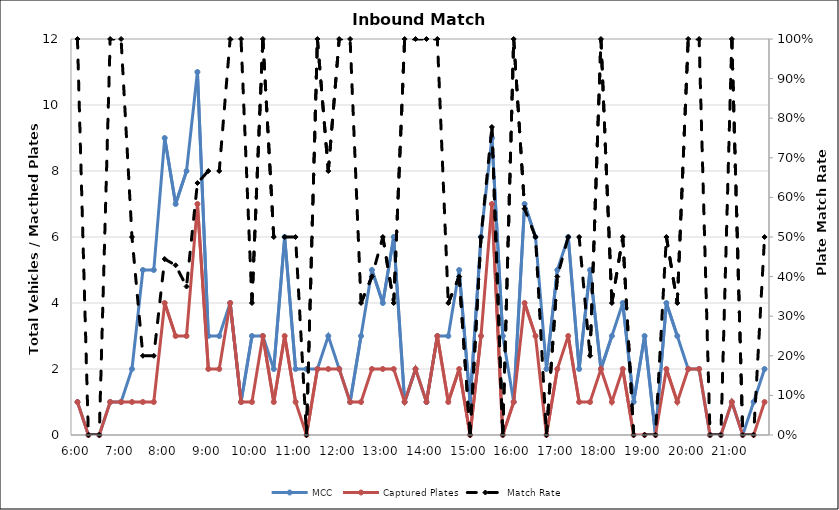
| Category | MCC | Captured Plates |
|---|---|---|
| 0.25 | 1 | 1 |
| 0.260416666666667 | 0 | 0 |
| 0.270833333333333 | 0 | 0 |
| 0.28125 | 1 | 1 |
| 0.291666666666667 | 1 | 1 |
| 0.302083333333333 | 2 | 1 |
| 0.3125 | 5 | 1 |
| 0.322916666666667 | 5 | 1 |
| 0.333333333333333 | 9 | 4 |
| 0.34375 | 7 | 3 |
| 0.354166666666667 | 8 | 3 |
| 0.364583333333333 | 11 | 7 |
| 0.375 | 3 | 2 |
| 0.385416666666667 | 3 | 2 |
| 0.395833333333333 | 4 | 4 |
| 0.40625 | 1 | 1 |
| 0.416666666666667 | 3 | 1 |
| 0.427083333333333 | 3 | 3 |
| 0.4375 | 2 | 1 |
| 0.447916666666667 | 6 | 3 |
| 0.458333333333333 | 2 | 1 |
| 0.46875 | 2 | 0 |
| 0.479166666666667 | 2 | 2 |
| 0.489583333333333 | 3 | 2 |
| 0.5 | 2 | 2 |
| 0.510416666666667 | 1 | 1 |
| 0.520833333333333 | 3 | 1 |
| 0.53125 | 5 | 2 |
| 0.541666666666667 | 4 | 2 |
| 0.552083333333333 | 6 | 2 |
| 0.5625 | 1 | 1 |
| 0.572916666666667 | 2 | 2 |
| 0.583333333333333 | 1 | 1 |
| 0.59375 | 3 | 3 |
| 0.604166666666667 | 3 | 1 |
| 0.614583333333333 | 5 | 2 |
| 0.625 | 1 | 0 |
| 0.635416666666667 | 6 | 3 |
| 0.645833333333333 | 9 | 7 |
| 0.65625 | 3 | 0 |
| 0.666666666666667 | 1 | 1 |
| 0.677083333333333 | 7 | 4 |
| 0.6875 | 6 | 3 |
| 0.697916666666667 | 2 | 0 |
| 0.708333333333333 | 5 | 2 |
| 0.71875 | 6 | 3 |
| 0.729166666666667 | 2 | 1 |
| 0.739583333333333 | 5 | 1 |
| 0.75 | 2 | 2 |
| 0.760416666666667 | 3 | 1 |
| 0.770833333333333 | 4 | 2 |
| 0.78125 | 1 | 0 |
| 0.791666666666667 | 3 | 0 |
| 0.802083333333333 | 0 | 0 |
| 0.8125 | 4 | 2 |
| 0.822916666666667 | 3 | 1 |
| 0.833333333333333 | 2 | 2 |
| 0.84375 | 2 | 2 |
| 0.854166666666667 | 0 | 0 |
| 0.864583333333333 | 0 | 0 |
| 0.875 | 1 | 1 |
| 0.885416666666667 | 0 | 0 |
| 0.895833333333333 | 1 | 0 |
| 0.90625 | 2 | 1 |